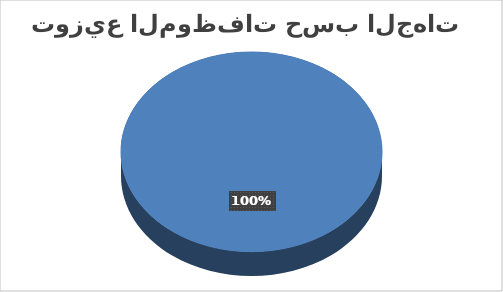
| Category | مصالح مركزية |
|---|---|
| إناث | 75 |